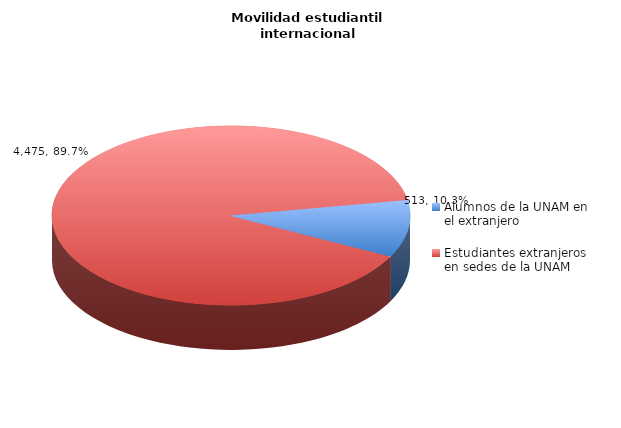
| Category | Series 0 |
|---|---|
| Alumnos de la UNAM en el extranjero | 513 |
| Estudiantes extranjeros en sedes de la UNAM | 4475 |